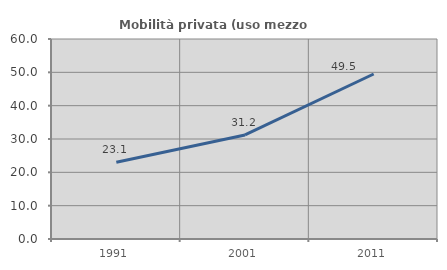
| Category | Mobilità privata (uso mezzo privato) |
|---|---|
| 1991.0 | 23.052 |
| 2001.0 | 31.224 |
| 2011.0 | 49.502 |